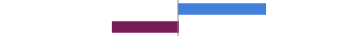
| Category | Series 0 |
|---|---|
| Favorable | 0.492 |
| Unfavorable | -0.374 |